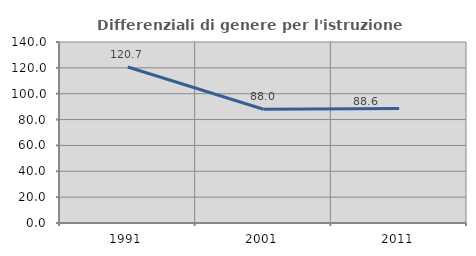
| Category | Differenziali di genere per l'istruzione superiore |
|---|---|
| 1991.0 | 120.656 |
| 2001.0 | 87.953 |
| 2011.0 | 88.601 |